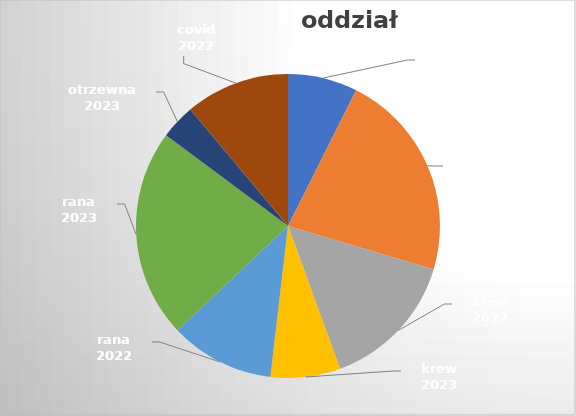
| Category | Series 0 |
|---|---|
| kał 2022 | 2 |
| kał 2023 | 6 |
| krew 2022 | 4 |
| krew 2023 | 2 |
| rana 2022 | 3 |
| rana 2023 | 6 |
| otrzewna 2023 | 1 |
| covid 2022 | 3 |